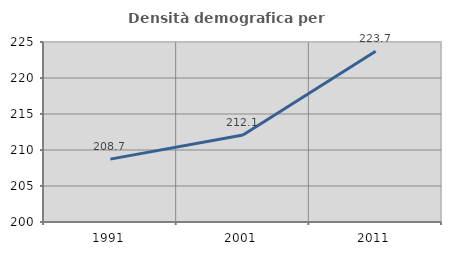
| Category | Densità demografica |
|---|---|
| 1991.0 | 208.732 |
| 2001.0 | 212.074 |
| 2011.0 | 223.708 |